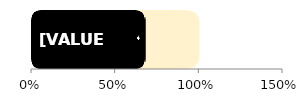
| Category | Total | Men |
|---|---|---|
| 0 | 1 | 0.68 |